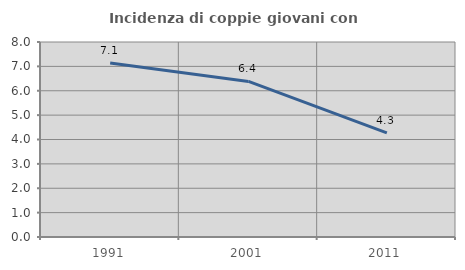
| Category | Incidenza di coppie giovani con figli |
|---|---|
| 1991.0 | 7.143 |
| 2001.0 | 6.383 |
| 2011.0 | 4.274 |